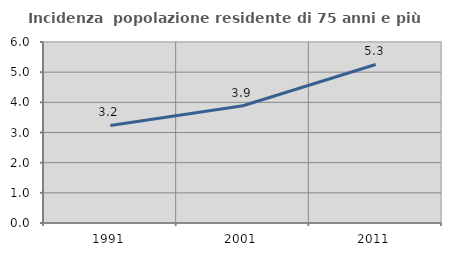
| Category | Incidenza  popolazione residente di 75 anni e più |
|---|---|
| 1991.0 | 3.235 |
| 2001.0 | 3.889 |
| 2011.0 | 5.256 |